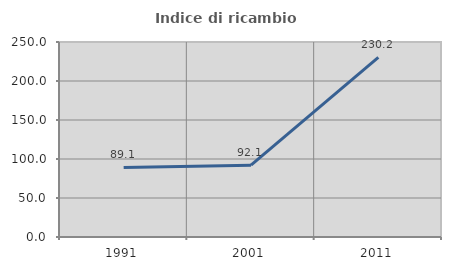
| Category | Indice di ricambio occupazionale  |
|---|---|
| 1991.0 | 89.13 |
| 2001.0 | 92.105 |
| 2011.0 | 230.233 |